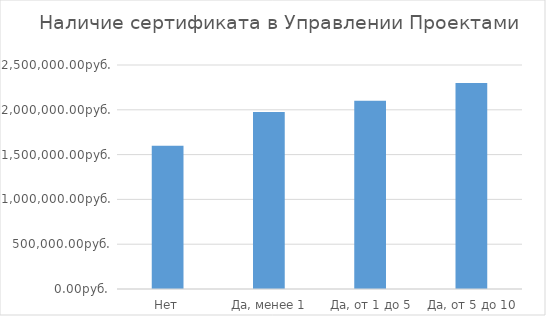
| Category | Series 0 |
|---|---|
| Нет | 1600000 |
| Да, менее 1 года | 1975000 |
| Да, от 1 до 5 лет | 2100000 |
| Да, от 5 до 10 лет | 2300000 |